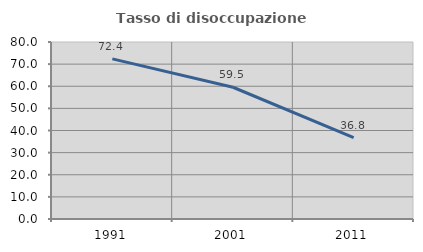
| Category | Tasso di disoccupazione giovanile  |
|---|---|
| 1991.0 | 72.365 |
| 2001.0 | 59.545 |
| 2011.0 | 36.803 |